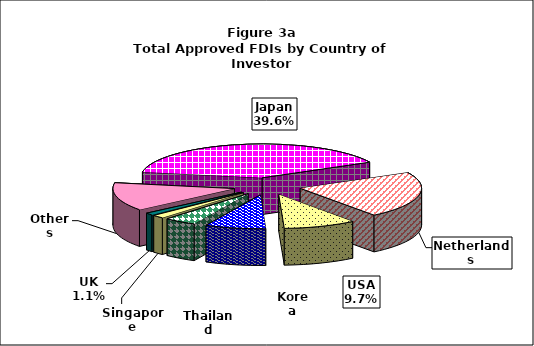
| Category | Series 0 |
|---|---|
| Japan | 17433.596 |
| Netherlands | 9806.2 |
| USA | 4268.089 |
| Korea | 3559.783 |
| Thailand | 1885.937 |
| Singapore | 698.693 |
| UK | 473.049 |
| Others | 5943.147 |